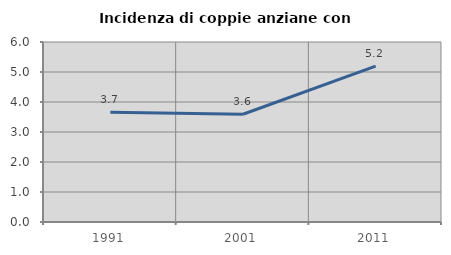
| Category | Incidenza di coppie anziane con figli |
|---|---|
| 1991.0 | 3.656 |
| 2001.0 | 3.593 |
| 2011.0 | 5.195 |